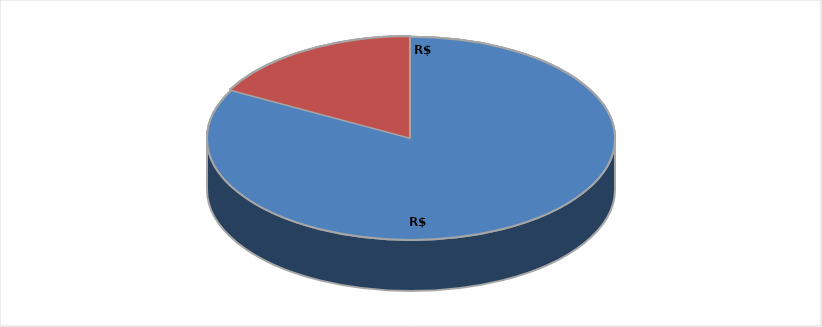
| Category | Series 0 |
|---|---|
| 0 | 11096646.97 |
| 1 | 2297269.92 |